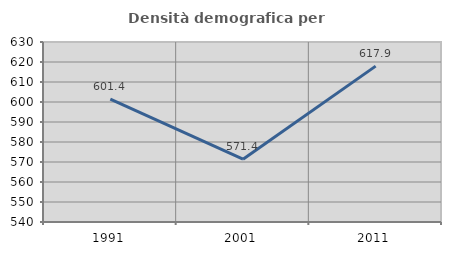
| Category | Densità demografica |
|---|---|
| 1991.0 | 601.418 |
| 2001.0 | 571.421 |
| 2011.0 | 617.929 |